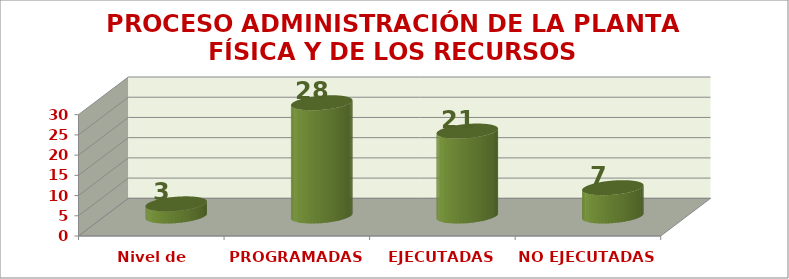
| Category | PROCESO ADMINISTRACIÓN DE LA PLANTA FÍSICA Y DE LOS RECURSOS |
|---|---|
| Nivel de satisfacción | 3 |
| PROGRAMADAS | 28 |
| EJECUTADAS | 21 |
| NO EJECUTADAS | 7 |